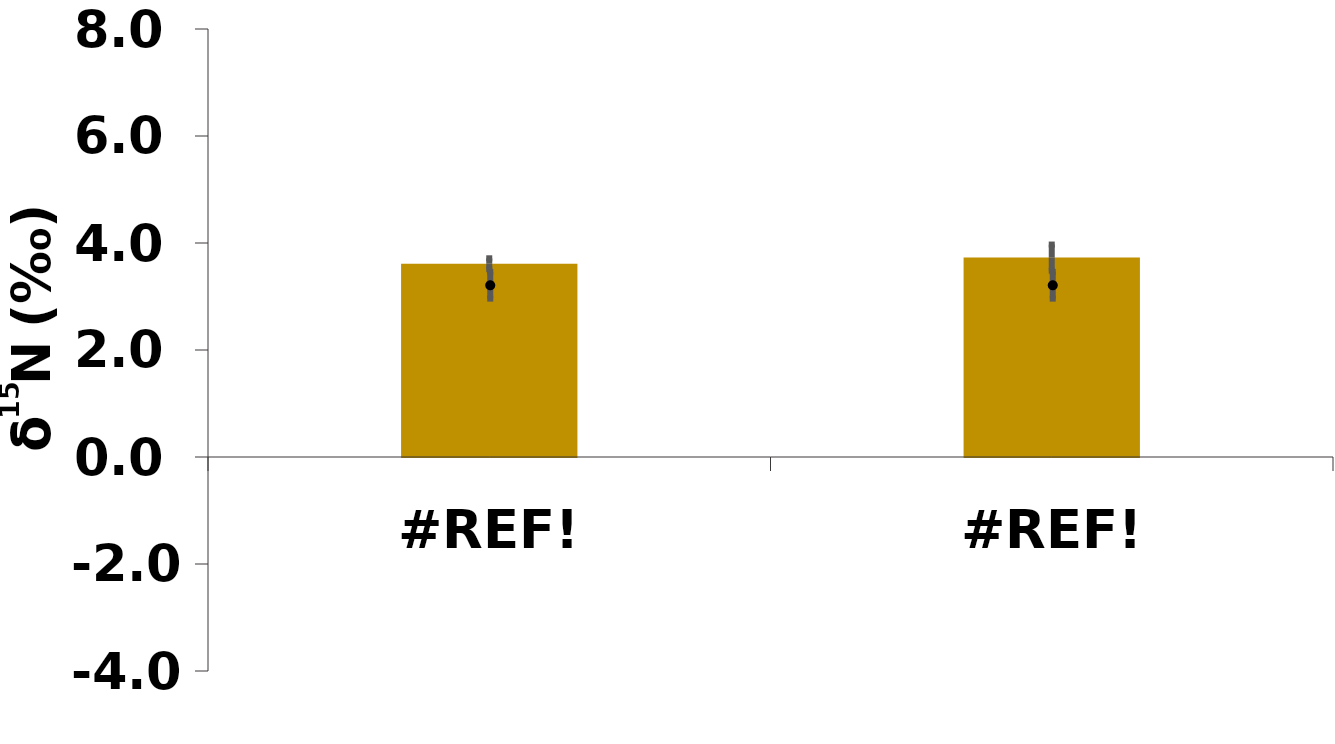
| Category | Whole plant |
|---|---|
| 0.0 | 3.612 |
| 0.0 | 3.727 |